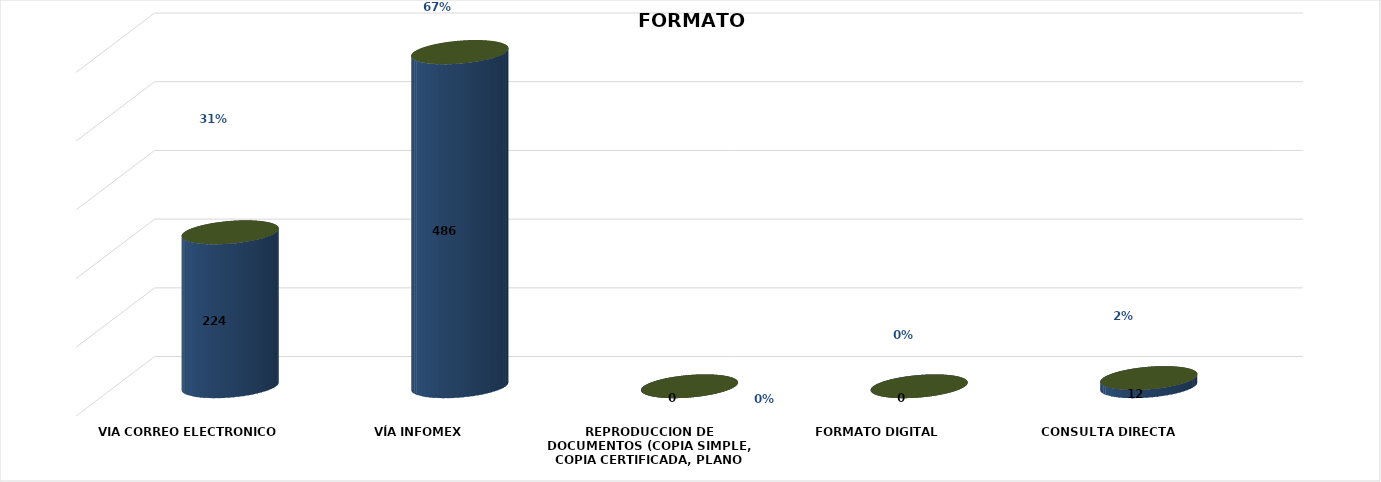
| Category | Series 0 | Series 1 | Series 2 | Series 3 | Series 4 |
|---|---|---|---|---|---|
| VIA CORREO ELECTRONICO |  |  |  | 224 | 0.31 |
| VÍA INFOMEX |  |  |  | 486 | 0.673 |
| REPRODUCCION DE DOCUMENTOS (COPIA SIMPLE, COPIA CERTIFICADA, PLANO SIMPLE Y PLANO CERTIFICADO) |  |  |  | 0 | 0 |
| FORMATO DIGITAL |  |  |  | 0 | 0 |
| CONSULTA DIRECTA |  |  |  | 12 | 0.017 |